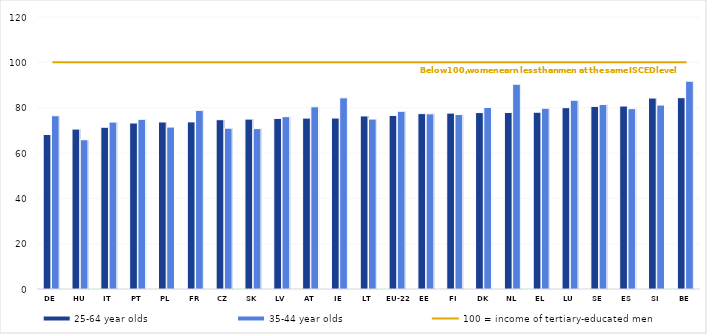
| Category | 25-64 year olds | 35-44 year olds |
|---|---|---|
| DE | 68.158 | 76.442 |
| HU | 70.542 | 65.846 |
| IT | 71.365 | 73.643 |
| PT | 73.234 | 74.859 |
| PL | 73.681 | 71.442 |
| FR | 73.729 | 78.806 |
| CZ | 74.69 | 70.956 |
| SK | 74.95 | 70.764 |
| LV | 75.273 | 76.034 |
| AT | 75.393 | 80.378 |
| IE | 75.427 | 84.334 |
| LT | 76.352 | 74.972 |
| EU-22 | 76.573 | 78.408 |
| EE | 77.373 | 77.266 |
| FI | 77.593 | 76.993 |
| DK | 77.835 | 80.095 |
| NL | 77.891 | 90.356 |
| EL | 78.01 | 79.752 |
| LU | 80.006 | 83.286 |
| SE | 80.547 | 81.411 |
| ES | 80.708 | 79.57 |
| SI | 84.241 | 81.168 |
| BE | 84.4 | 91.685 |